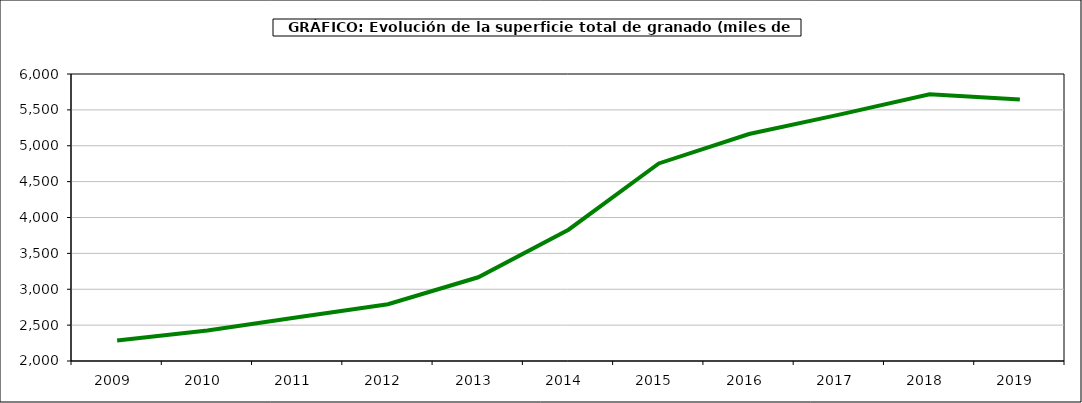
| Category | superficie granado |
|---|---|
| 2009.0 | 2285 |
| 2010.0 | 2425 |
| 2011.0 | 2610 |
| 2012.0 | 2791 |
| 2013.0 | 3167 |
| 2014.0 | 3830 |
| 2015.0 | 4753 |
| 2016.0 | 5163 |
| 2017.0 | 5434 |
| 2018.0 | 5716 |
| 2019.0 | 5645 |